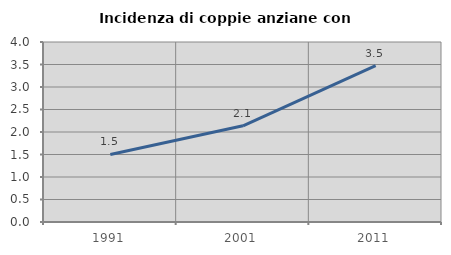
| Category | Incidenza di coppie anziane con figli |
|---|---|
| 1991.0 | 1.502 |
| 2001.0 | 2.138 |
| 2011.0 | 3.476 |